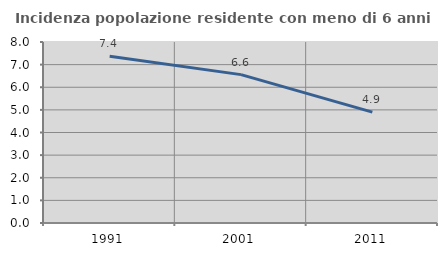
| Category | Incidenza popolazione residente con meno di 6 anni |
|---|---|
| 1991.0 | 7.366 |
| 2001.0 | 6.558 |
| 2011.0 | 4.903 |